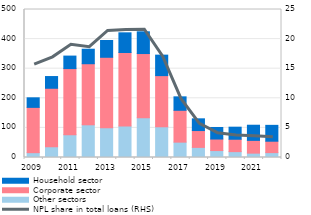
| Category | Other sectors | Corporate sector | Household sector |
|---|---|---|---|
| 2009 | 16.3 | 153.043 | 32.3 |
| 2010 | 36.3 | 197.6 | 39.6 |
| 2011 | 77.1 | 223.3 | 42.2 |
| 2012 | 110.5 | 206.3 | 49 |
| 2013 | 100.2 | 238.4 | 56.7 |
| 2014 | 106.4 | 248.4 | 66.4 |
| 2015 | 134.4 | 216.8 | 73.4 |
| 2016 | 103.8 | 172.8 | 69.2 |
| 2017 | 51.9 | 107.6 | 45.4 |
| 2018 | 34.192 | 56.849 | 39.608 |
| 2019 | 23.45 | 38.949 | 39.017 |
| 2020 | 19.835 | 41.827 | 40.747 |
| 2021 | 14.723 | 43.14 | 51.148 |
| March
2022 | 16.48 | 38.535 | 53.608 |